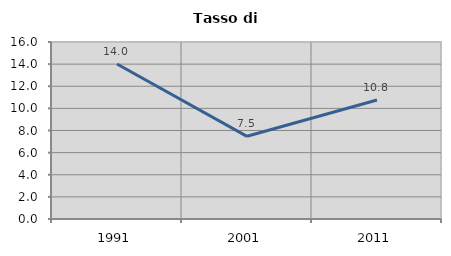
| Category | Tasso di disoccupazione   |
|---|---|
| 1991.0 | 14.014 |
| 2001.0 | 7.474 |
| 2011.0 | 10.762 |